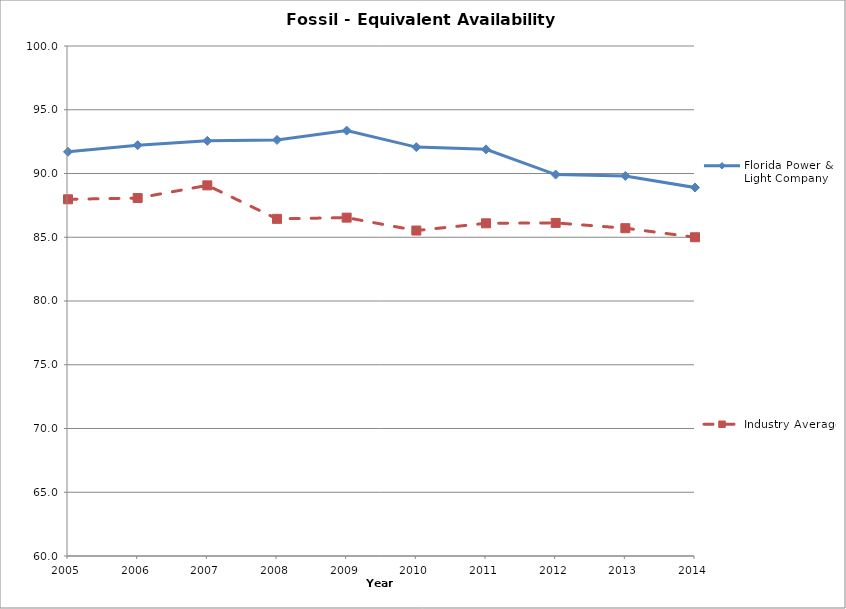
| Category | Florida Power & Light Company | Industry Average |
|---|---|---|
| 2005.0 | 91.703 | 87.977 |
| 2006.0 | 92.221 | 88.074 |
| 2007.0 | 92.561 | 89.069 |
| 2008.0 | 92.634 | 86.443 |
| 2009.0 | 93.363 | 86.539 |
| 2010.0 | 92.07 | 85.526 |
| 2011.0 | 91.893 | 86.094 |
| 2012.0 | 89.917 | 86.124 |
| 2013.0 | 89.809 | 85.711 |
| 2014.0 | 88.9 | 85 |